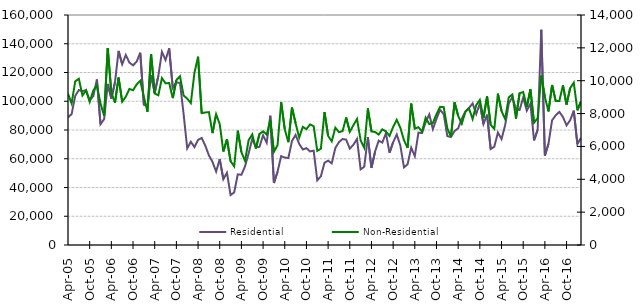
| Category | Residential |
|---|---|
| 2005-04-01 | 88840 |
| 2005-05-01 | 91030 |
| 2005-06-01 | 103700 |
| 2005-07-01 | 107770 |
| 2005-08-01 | 107040 |
| 2005-09-01 | 107710 |
| 2005-10-01 | 100650 |
| 2005-11-01 | 103570 |
| 2005-12-01 | 115150 |
| 2006-01-01 | 83980 |
| 2006-02-01 | 87550 |
| 2006-03-01 | 112090 |
| 2006-04-01 | 101830 |
| 2006-05-01 | 113160 |
| 2006-06-01 | 135030 |
| 2006-07-01 | 125720 |
| 2006-08-01 | 132180 |
| 2006-09-01 | 126890 |
| 2006-10-01 | 124980 |
| 2006-11-01 | 127530 |
| 2006-12-01 | 133770 |
| 2007-01-01 | 97580 |
| 2007-02-01 | 96560 |
| 2007-03-01 | 117970 |
| 2007-04-01 | 105780 |
| 2007-05-01 | 117560 |
| 2007-06-01 | 134370 |
| 2007-07-01 | 128660 |
| 2007-08-01 | 136790 |
| 2007-09-01 | 109250 |
| 2007-10-01 | 113080 |
| 2007-11-01 | 112770 |
| 2007-12-01 | 91140 |
| 2008-01-01 | 67220 |
| 2008-02-01 | 71820 |
| 2008-03-01 | 68100 |
| 2008-04-01 | 73130 |
| 2008-05-01 | 74470 |
| 2008-06-01 | 69150 |
| 2008-07-01 | 62400 |
| 2008-08-01 | 57810 |
| 2008-09-01 | 51080 |
| 2008-10-01 | 59710 |
| 2008-11-01 | 45780 |
| 2008-12-01 | 50260 |
| 2009-01-01 | 34750 |
| 2009-02-01 | 36580 |
| 2009-03-01 | 49130 |
| 2009-04-01 | 48840 |
| 2009-05-01 | 54720 |
| 2009-06-01 | 63710 |
| 2009-07-01 | 73760 |
| 2009-08-01 | 68080 |
| 2009-09-01 | 68260 |
| 2009-10-01 | 76320 |
| 2009-11-01 | 71150 |
| 2009-12-01 | 89920 |
| 2010-01-01 | 43110 |
| 2010-02-01 | 50920 |
| 2010-03-01 | 61810 |
| 2010-04-01 | 60830 |
| 2010-05-01 | 60500 |
| 2010-06-01 | 72370 |
| 2010-07-01 | 76590 |
| 2010-08-01 | 70320 |
| 2010-09-01 | 66440 |
| 2010-10-01 | 67380 |
| 2010-11-01 | 65080 |
| 2010-12-01 | 65650 |
| 2011-01-01 | 44970 |
| 2011-02-01 | 47830 |
| 2011-03-01 | 57200 |
| 2011-04-01 | 58700 |
| 2011-05-01 | 56820 |
| 2011-06-01 | 67500 |
| 2011-07-01 | 71550 |
| 2011-08-01 | 73720 |
| 2011-09-01 | 73310 |
| 2011-10-01 | 67030 |
| 2011-11-01 | 69730 |
| 2011-12-01 | 73780 |
| 2012-01-01 | 52630 |
| 2012-02-01 | 54440 |
| 2012-03-01 | 74960 |
| 2012-04-01 | 53590 |
| 2012-05-01 | 64960 |
| 2012-06-01 | 72590 |
| 2012-07-01 | 71240 |
| 2012-08-01 | 77690 |
| 2012-09-01 | 64200 |
| 2012-10-01 | 71490 |
| 2012-11-01 | 76910 |
| 2012-12-01 | 69100 |
| 2013-01-01 | 53990 |
| 2013-02-01 | 56120 |
| 2013-03-01 | 67740 |
| 2013-04-01 | 61780 |
| 2013-05-01 | 78170 |
| 2013-06-01 | 77850 |
| 2013-07-01 | 85310 |
| 2013-08-01 | 90850 |
| 2013-09-01 | 80640 |
| 2013-10-01 | 87730 |
| 2013-11-01 | 94020 |
| 2013-12-01 | 91030 |
| 2014-01-01 | 75750 |
| 2014-02-01 | 75100 |
| 2014-03-01 | 79280 |
| 2014-04-01 | 81140 |
| 2014-05-01 | 87930 |
| 2014-06-01 | 92950 |
| 2014-07-01 | 95430 |
| 2014-08-01 | 98450 |
| 2014-09-01 | 91170 |
| 2014-10-01 | 98630 |
| 2014-11-01 | 84150 |
| 2014-12-01 | 90650 |
| 2015-01-01 | 66750 |
| 2015-02-01 | 68390 |
| 2015-03-01 | 78240 |
| 2015-04-01 | 73690 |
| 2015-05-01 | 83310 |
| 2015-06-01 | 98200 |
| 2015-07-01 | 103160 |
| 2015-08-01 | 94260 |
| 2015-09-01 | 93940 |
| 2015-10-01 | 102540 |
| 2015-11-01 | 93490 |
| 2015-12-01 | 98400 |
| 2016-01-01 | 72750 |
| 2016-02-01 | 80110 |
| 2016-03-01 | 149710 |
| 2016-04-01 | 62140 |
| 2016-05-01 | 70470 |
| 2016-06-01 | 86820 |
| 2016-07-01 | 90200 |
| 2016-08-01 | 92620 |
| 2016-09-01 | 89060 |
| 2016-10-01 | 83210 |
| 2016-11-01 | 86820 |
| 2016-12-01 | 93440 |
| 2017-01-01 | 70220 |
| 2017-02-01 | 74550 |